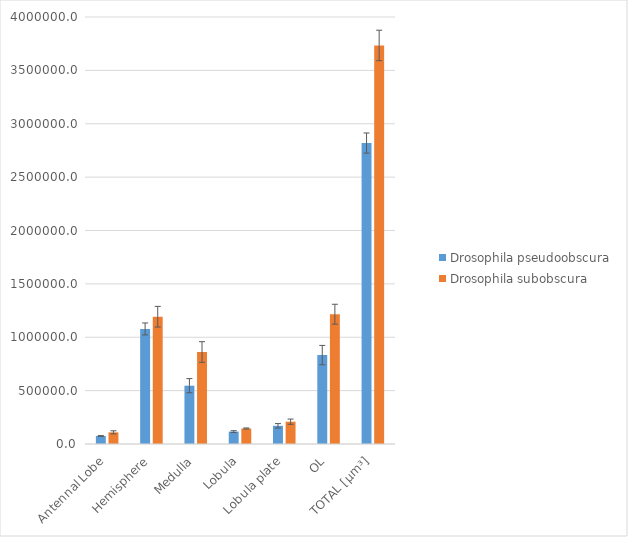
| Category | Drosophila pseudoobscura | Drosophila subobscura |
|---|---|---|
| Antennal Lobe | 75240.483 | 109170.833 |
| Hemisphere | 1077905.4 | 1192306.3 |
| Medulla | 546440.667 | 861932.933 |
| Lobula | 116287.167 | 145070.733 |
| Lobula plate | 170356.967 | 208897.833 |
| OL | 833084.8 | 1215901.5 |
| TOTAL [µm³] | 2819315.483 | 3733280.133 |